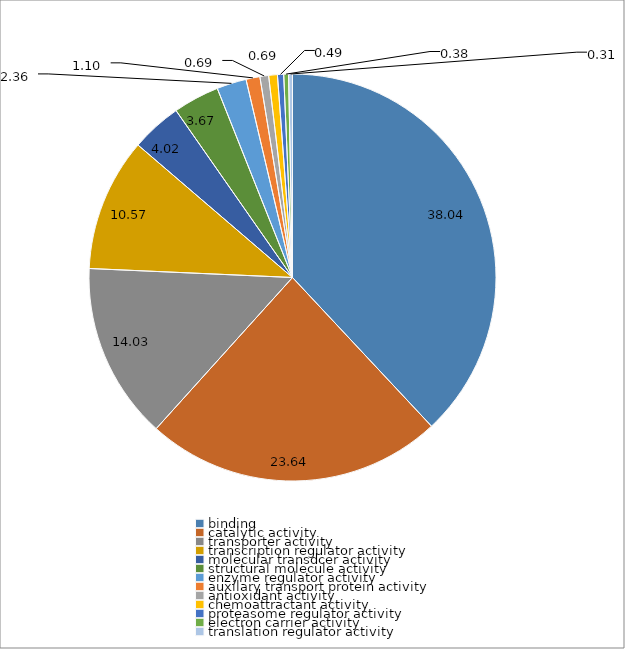
| Category | Series 0 |
|---|---|
| binding | 38.035 |
| catalytic activity | 23.644 |
| transporter activity | 14.026 |
| transcription regulator activity | 10.574 |
| molecular transdcer activity | 4.024 |
| structural molecule activity | 3.669 |
| enzyme regulator activity | 2.357 |
| auxilary transport protein activity | 1.105 |
| antioxidant activity | 0.69 |
| chemoattractant activity | 0.69 |
| proteasome regulator activity | 0.493 |
| electron carrier activity | 0.385 |
| translation regulator activity | 0.306 |